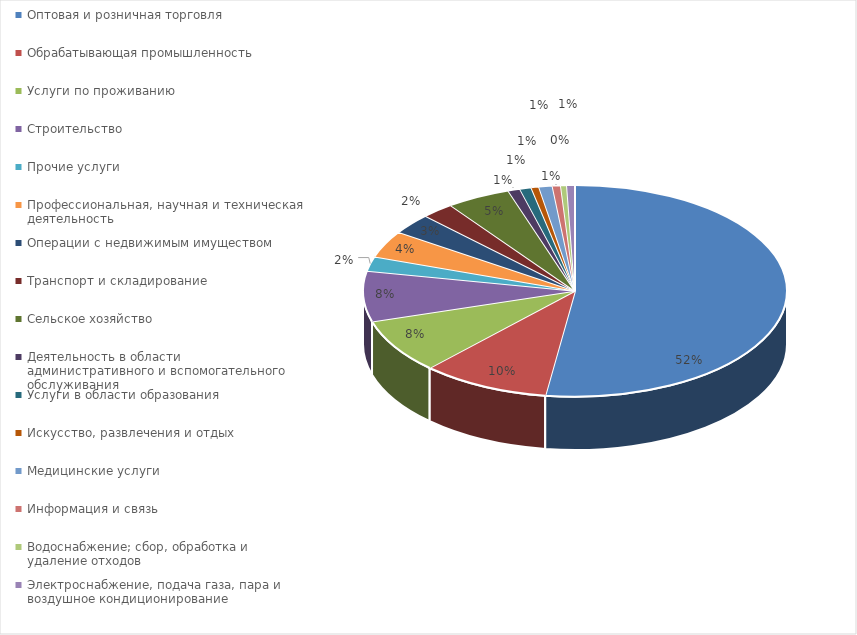
| Category | Series 0 |
|---|---|
| Оптовая и розничная торговля | 0.522 |
| Обрабатывающая промышленность | 0.098 |
| Услуги по проживанию | 0.083 |
| Строительство | 0.077 |
| Прочие услуги | 0.022 |
| Профессиональная, научная и техническая деятельность | 0.041 |
| Операции с недвижимым имуществом | 0.031 |
| Транспорт и складирование | 0.025 |
| Сельское хозяйство | 0.049 |
| Деятельность в области административного и вспомогательного обслуживания | 0.009 |
| Услуги в области образования | 0.009 |
| Искусство, развлечения и отдых | 0.006 |
| Медицинские услуги | 0.01 |
| Информация и связь | 0.006 |
| Водоснабжение; сбор, обработка и удаление отходов | 0.005 |
| Электроснабжение, подача газа, пара и воздушное кондиционирование | 0.006 |